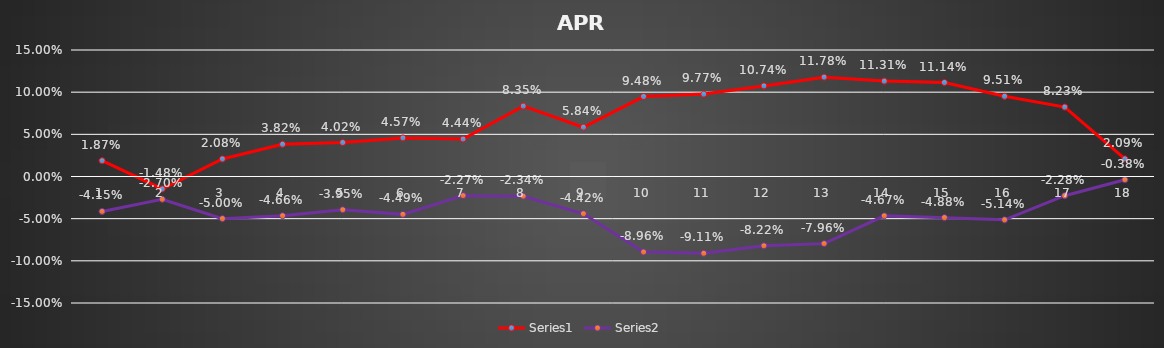
| Category | Series 0 | Series 1 |
|---|---|---|
| 0 | 0.019 | -0.042 |
| 1 | -0.015 | -0.027 |
| 2 | 0.021 | -0.05 |
| 3 | 0.038 | -0.047 |
| 4 | 0.04 | -0.04 |
| 5 | 0.046 | -0.045 |
| 6 | 0.044 | -0.023 |
| 7 | 0.084 | -0.023 |
| 8 | 0.058 | -0.044 |
| 9 | 0.095 | -0.09 |
| 10 | 0.098 | -0.091 |
| 11 | 0.107 | -0.082 |
| 12 | 0.118 | -0.08 |
| 13 | 0.113 | -0.047 |
| 14 | 0.111 | -0.049 |
| 15 | 0.095 | -0.051 |
| 16 | 0.082 | -0.023 |
| 17 | 0.021 | -0.004 |